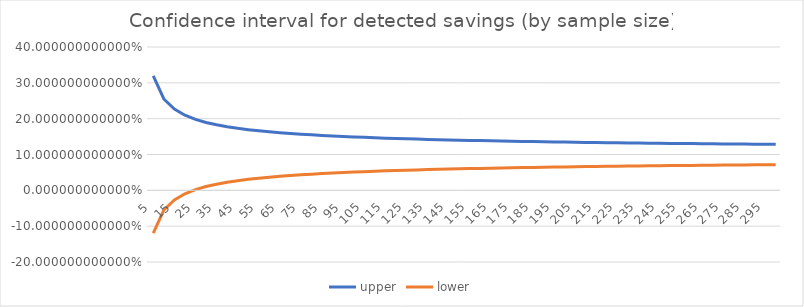
| Category | upper | lower |
|---|---|---|
| 5.0 | 0.319 | -0.119 |
| 10.0 | 0.255 | -0.055 |
| 15.0 | 0.227 | -0.027 |
| 20.0 | 0.21 | -0.01 |
| 25.0 | 0.198 | 0.002 |
| 30.0 | 0.189 | 0.011 |
| 35.0 | 0.183 | 0.017 |
| 40.0 | 0.177 | 0.023 |
| 45.0 | 0.173 | 0.027 |
| 50.0 | 0.169 | 0.031 |
| 55.0 | 0.166 | 0.034 |
| 60.0 | 0.163 | 0.037 |
| 65.0 | 0.161 | 0.039 |
| 70.0 | 0.159 | 0.041 |
| 75.0 | 0.157 | 0.043 |
| 80.0 | 0.155 | 0.045 |
| 85.0 | 0.153 | 0.047 |
| 90.0 | 0.152 | 0.048 |
| 95.0 | 0.15 | 0.05 |
| 100.0 | 0.149 | 0.051 |
| 105.0 | 0.148 | 0.052 |
| 110.0 | 0.147 | 0.053 |
| 115.0 | 0.146 | 0.054 |
| 120.0 | 0.145 | 0.055 |
| 125.0 | 0.144 | 0.056 |
| 130.0 | 0.143 | 0.057 |
| 135.0 | 0.142 | 0.058 |
| 140.0 | 0.141 | 0.059 |
| 145.0 | 0.141 | 0.059 |
| 150.0 | 0.14 | 0.06 |
| 155.0 | 0.139 | 0.061 |
| 160.0 | 0.139 | 0.061 |
| 165.0 | 0.138 | 0.062 |
| 170.0 | 0.138 | 0.062 |
| 175.0 | 0.137 | 0.063 |
| 180.0 | 0.137 | 0.063 |
| 185.0 | 0.136 | 0.064 |
| 190.0 | 0.136 | 0.064 |
| 195.0 | 0.135 | 0.065 |
| 200.0 | 0.135 | 0.065 |
| 205.0 | 0.134 | 0.066 |
| 210.0 | 0.134 | 0.066 |
| 215.0 | 0.133 | 0.067 |
| 220.0 | 0.133 | 0.067 |
| 225.0 | 0.133 | 0.067 |
| 230.0 | 0.132 | 0.068 |
| 235.0 | 0.132 | 0.068 |
| 240.0 | 0.132 | 0.068 |
| 245.0 | 0.131 | 0.069 |
| 250.0 | 0.131 | 0.069 |
| 255.0 | 0.131 | 0.069 |
| 260.0 | 0.13 | 0.07 |
| 265.0 | 0.13 | 0.07 |
| 270.0 | 0.13 | 0.07 |
| 275.0 | 0.13 | 0.07 |
| 280.0 | 0.129 | 0.071 |
| 285.0 | 0.129 | 0.071 |
| 290.0 | 0.129 | 0.071 |
| 295.0 | 0.129 | 0.071 |
| 300.0 | 0.128 | 0.072 |